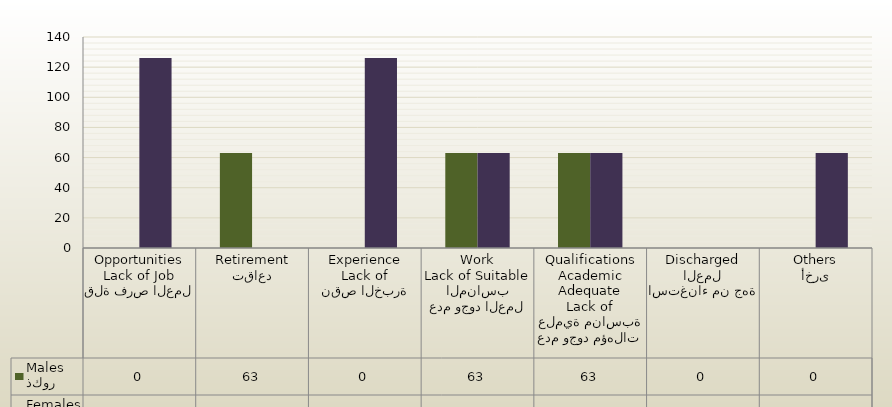
| Category | ذكور
Males | اناث
Females |
|---|---|---|
| قلة فرص العمل
Lack of Job Opportunities | 0 | 126 |
| تقاعد
Retirement | 63 | 0 |
| نقص الخبرة
Lack of Experience | 0 | 126 |
| عدم وجود العمل المناسب
Lack of Suitable Work | 63 | 63 |
| عدم وجود مؤهلات علمية مناسبة
Lack of Adequate Academic Qualifications | 63 | 63 |
| استغناء من جهة العمل
Discharged | 0 | 0 |
| أخرى
Others | 0 | 63 |